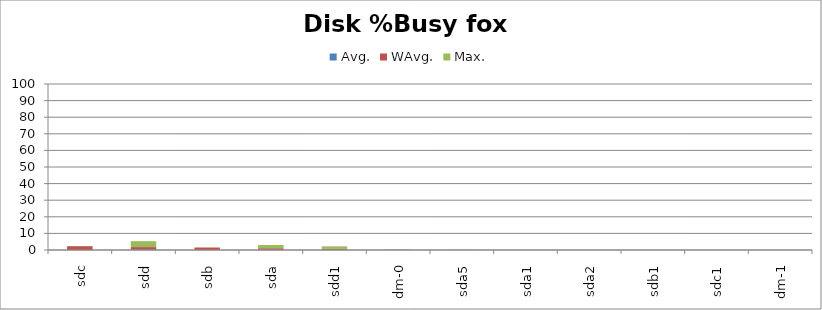
| Category | Avg. | WAvg. | Max. |
|---|---|---|---|
| sdc | 0.038 | 2.262 | 0 |
| sdd | 0.373 | 1.385 | 3.542 |
| sdb | 0.025 | 1.475 | 0 |
| sda | 0.155 | 0.902 | 1.943 |
| sdd1 | 0.285 | 0.375 | 1.54 |
| dm-0 | 0.105 | 0.027 | 0.168 |
| sda5 | 0.008 | 0.092 | 0 |
| sda1 | 0 | 0 | 0 |
| sda2 | 0 | 0 | 0 |
| sdb1 | 0 | 0 | 0 |
| sdc1 | 0 | 0 | 0 |
| dm-1 | 0 | 0 | 0 |